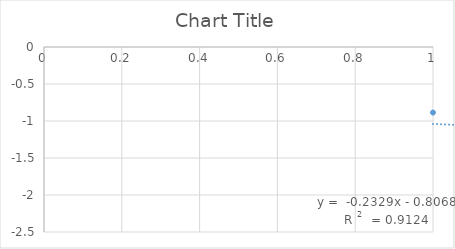
| Category | Series 0 |
|---|---|
| 0 | -0.885 |
| 1 | -1.406 |
| 2 | -1.638 |
| 3 | -1.742 |
| 4 | -1.801 |
| 5 | -2.258 |